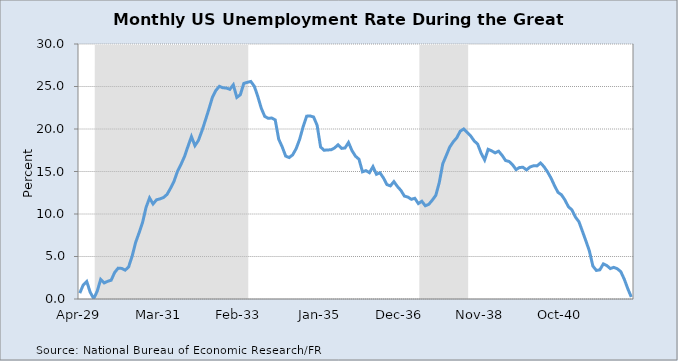
| Category | Series 0 |
|---|---|
| 10684.0 | 0.69 |
| 10714.0 | 1.65 |
| 10745.0 | 2.06 |
| 10775.0 | 0.79 |
| 10806.0 | 0.04 |
| 10837.0 | 0.91 |
| 10867.0 | 2.31 |
| 10898.0 | 1.89 |
| 10928.0 | 2.08 |
| 10959.0 | 2.21 |
| 10990.0 | 3.12 |
| 11018.0 | 3.63 |
| 11049.0 | 3.6 |
| 11079.0 | 3.39 |
| 11110.0 | 3.77 |
| 11140.0 | 5.02 |
| 11171.0 | 6.64 |
| 11202.0 | 7.79 |
| 11232.0 | 9.01 |
| 11263.0 | 10.78 |
| 11293.0 | 11.89 |
| 11324.0 | 11.18 |
| 11355.0 | 11.67 |
| 11383.0 | 11.78 |
| 11414.0 | 11.94 |
| 11444.0 | 12.3 |
| 11475.0 | 13.02 |
| 11505.0 | 13.84 |
| 11536.0 | 15.01 |
| 11567.0 | 15.83 |
| 11597.0 | 16.75 |
| 11628.0 | 17.95 |
| 11658.0 | 19.1 |
| 11689.0 | 18.04 |
| 11720.0 | 18.66 |
| 11749.0 | 19.78 |
| 11780.0 | 21.03 |
| 11810.0 | 22.34 |
| 11841.0 | 23.72 |
| 11871.0 | 24.54 |
| 11902.0 | 25.02 |
| 11933.0 | 24.85 |
| 11963.0 | 24.82 |
| 11994.0 | 24.67 |
| 12024.0 | 25.2 |
| 12055.0 | 23.72 |
| 12086.0 | 24.03 |
| 12114.0 | 25.36 |
| 12145.0 | 25.49 |
| 12175.0 | 25.59 |
| 12206.0 | 25.04 |
| 12236.0 | 23.84 |
| 12267.0 | 22.45 |
| 12298.0 | 21.48 |
| 12328.0 | 21.26 |
| 12359.0 | 21.29 |
| 12389.0 | 21.07 |
| 12420.0 | 18.8 |
| 12451.0 | 17.9 |
| 12479.0 | 16.81 |
| 12510.0 | 16.64 |
| 12540.0 | 16.96 |
| 12571.0 | 17.69 |
| 12601.0 | 18.79 |
| 12632.0 | 20.27 |
| 12663.0 | 21.51 |
| 12693.0 | 21.54 |
| 12724.0 | 21.41 |
| 12754.0 | 20.44 |
| 12785.0 | 17.88 |
| 12816.0 | 17.5 |
| 12844.0 | 17.54 |
| 12875.0 | 17.55 |
| 12905.0 | 17.77 |
| 12936.0 | 18.14 |
| 12966.0 | 17.72 |
| 12997.0 | 17.77 |
| 13028.0 | 18.41 |
| 13058.0 | 17.45 |
| 13089.0 | 16.8 |
| 13119.0 | 16.44 |
| 13150.0 | 14.96 |
| 13181.0 | 15.1 |
| 13210.0 | 14.86 |
| 13241.0 | 15.57 |
| 13271.0 | 14.67 |
| 13302.0 | 14.85 |
| 13332.0 | 14.25 |
| 13363.0 | 13.46 |
| 13394.0 | 13.31 |
| 13424.0 | 13.81 |
| 13455.0 | 13.24 |
| 13485.0 | 12.78 |
| 13516.0 | 12.11 |
| 13547.0 | 11.99 |
| 13575.0 | 11.73 |
| 13606.0 | 11.85 |
| 13636.0 | 11.23 |
| 13667.0 | 11.5 |
| 13697.0 | 10.97 |
| 13728.0 | 11.14 |
| 13759.0 | 11.63 |
| 13789.0 | 12.19 |
| 13820.0 | 13.7 |
| 13850.0 | 15.91 |
| 13881.0 | 16.88 |
| 13912.0 | 17.88 |
| 13940.0 | 18.49 |
| 13971.0 | 18.96 |
| 14001.0 | 19.74 |
| 14032.0 | 20 |
| 14062.0 | 19.58 |
| 14093.0 | 19.18 |
| 14124.0 | 18.6 |
| 14154.0 | 18.22 |
| 14185.0 | 17.14 |
| 14215.0 | 16.36 |
| 14246.0 | 17.61 |
| 14277.0 | 17.43 |
| 14305.0 | 17.19 |
| 14336.0 | 17.39 |
| 14366.0 | 16.9 |
| 14397.0 | 16.29 |
| 14427.0 | 16.18 |
| 14458.0 | 15.79 |
| 14489.0 | 15.22 |
| 14519.0 | 15.48 |
| 14550.0 | 15.49 |
| 14580.0 | 15.19 |
| 14611.0 | 15.53 |
| 14642.0 | 15.67 |
| 14671.0 | 15.66 |
| 14702.0 | 16 |
| 14732.0 | 15.57 |
| 14763.0 | 14.96 |
| 14793.0 | 14.24 |
| 14824.0 | 13.35 |
| 14855.0 | 12.55 |
| 14885.0 | 12.26 |
| 14916.0 | 11.65 |
| 14946.0 | 10.85 |
| 14977.0 | 10.49 |
| 15008.0 | 9.64 |
| 15036.0 | 9.1 |
| 15067.0 | 7.98 |
| 15097.0 | 6.84 |
| 15128.0 | 5.66 |
| 15158.0 | 3.88 |
| 15189.0 | 3.36 |
| 15220.0 | 3.43 |
| 15250.0 | 4.13 |
| 15281.0 | 3.93 |
| 15311.0 | 3.58 |
| 15342.0 | 3.72 |
| 15373.0 | 3.56 |
| 15401.0 | 3.22 |
| 15432.0 | 2.33 |
| 15462.0 | 1.22 |
| 15493.0 | 0.24 |